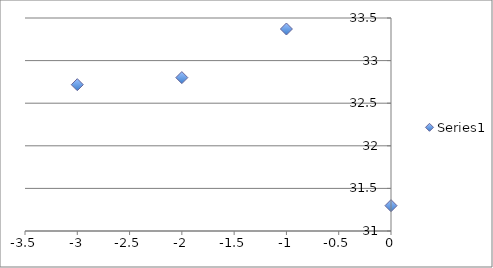
| Category | Series 0 |
|---|---|
| 0.0 | 31.297 |
| -1.0 | 33.371 |
| -2.0 | 32.8 |
| -3.0 | 32.717 |